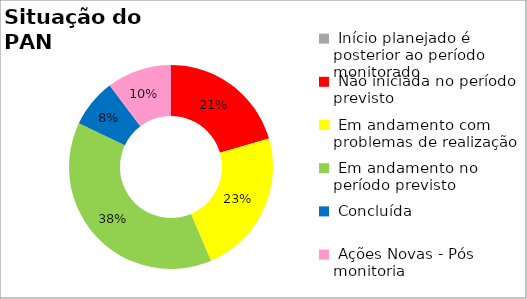
| Category | Series 0 |
|---|---|
|  Início planejado é posterior ao período monitorado | 0 |
|  Não iniciada no período previsto | 0.205 |
|  Em andamento com problemas de realização | 0.231 |
|  Em andamento no período previsto  | 0.385 |
|  Concluída | 0.077 |
|  Ações Novas - Pós monitoria | 0.103 |